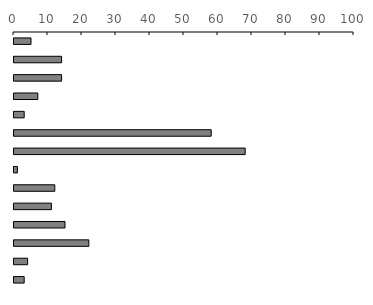
| Category | Series 0 |
|---|---|
| 0 | 5 |
| 1 | 14 |
| 2 | 14 |
| 3 | 7 |
| 4 | 3 |
| 5 | 58 |
| 6 | 68 |
| 7 | 1 |
| 8 | 12 |
| 9 | 11 |
| 10 | 15 |
| 11 | 22 |
| 12 | 4 |
| 13 | 3 |